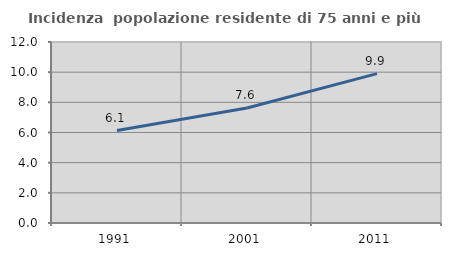
| Category | Incidenza  popolazione residente di 75 anni e più |
|---|---|
| 1991.0 | 6.126 |
| 2001.0 | 7.626 |
| 2011.0 | 9.905 |